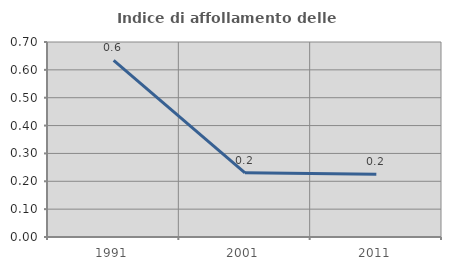
| Category | Indice di affollamento delle abitazioni  |
|---|---|
| 1991.0 | 0.634 |
| 2001.0 | 0.23 |
| 2011.0 | 0.225 |